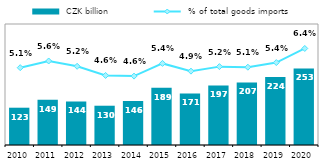
| Category |  CZK billion |
|---|---|
| 2010 | 123.278 |
| 2011 | 149.274 |
| 2012 | 143.98 |
| 2013 | 129.839 |
| 2014 | 145.75 |
| 2015 | 189.009 |
| 2016 | 170.63 |
| 2017 | 196.963 |
| 2018 | 206.974 |
| 2019 | 224.436 |
| 2020 | 253.026 |